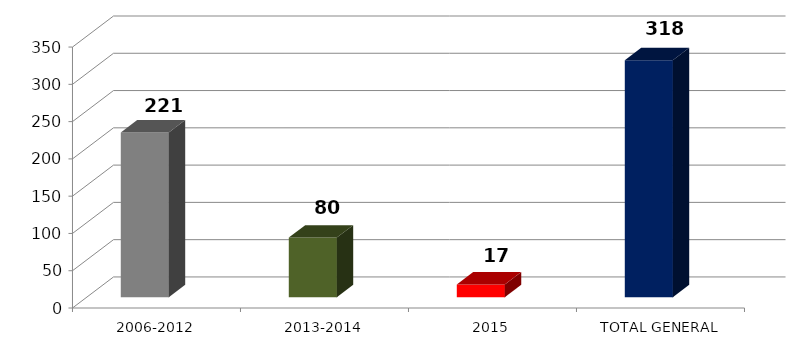
| Category | Series 0 | Series 1 |
|---|---|---|
| 2006-2012 | 221 |  |
| 2013-2014 | 80 |  |
| 2015 | 17 |  |
| TOTAL GENERAL | 318 |  |